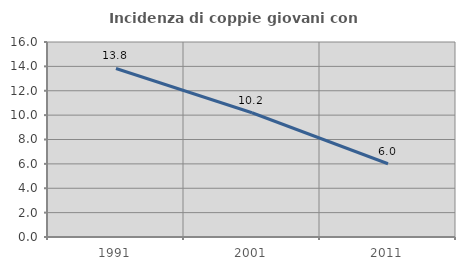
| Category | Incidenza di coppie giovani con figli |
|---|---|
| 1991.0 | 13.826 |
| 2001.0 | 10.194 |
| 2011.0 | 6.01 |